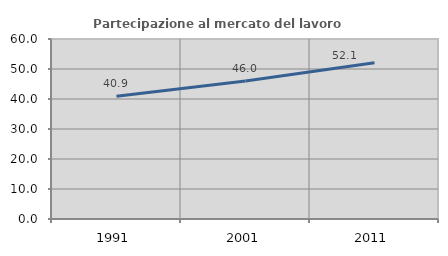
| Category | Partecipazione al mercato del lavoro  femminile |
|---|---|
| 1991.0 | 40.941 |
| 2001.0 | 46.008 |
| 2011.0 | 52.061 |